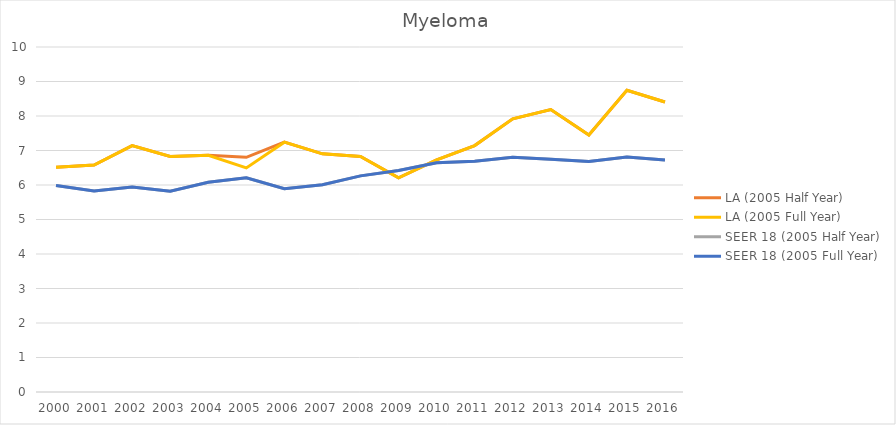
| Category | LA (2005 Half Year) | LA (2005 Full Year) | SEER 18 (2005 Half Year) | SEER 18 (2005 Full Year) |
|---|---|---|---|---|
| 2000.0 | 6.518 | 6.518 | 5.987 | 5.987 |
| 2001.0 | 6.578 | 6.578 | 5.829 | 5.829 |
| 2002.0 | 7.143 | 7.143 | 5.939 | 5.939 |
| 2003.0 | 6.825 | 6.825 | 5.819 | 5.819 |
| 2004.0 | 6.863 | 6.863 | 6.081 | 6.081 |
| 2005.0 | 6.802 | 6.496 | 6.211 | 6.211 |
| 2006.0 | 7.242 | 7.242 | 5.894 | 5.894 |
| 2007.0 | 6.904 | 6.904 | 6.006 | 6.006 |
| 2008.0 | 6.829 | 6.829 | 6.265 | 6.265 |
| 2009.0 | 6.206 | 6.206 | 6.422 | 6.422 |
| 2010.0 | 6.727 | 6.727 | 6.642 | 6.642 |
| 2011.0 | 7.143 | 7.143 | 6.689 | 6.689 |
| 2012.0 | 7.916 | 7.916 | 6.801 | 6.801 |
| 2013.0 | 8.186 | 8.186 | 6.745 | 6.745 |
| 2014.0 | 7.451 | 7.451 | 6.68 | 6.68 |
| 2015.0 | 8.745 | 8.745 | 6.808 | 6.808 |
| 2016.0 | 8.405 | 8.405 | 6.727 | 6.727 |